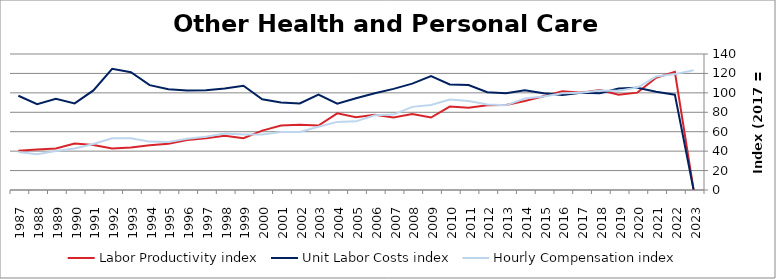
| Category | Labor Productivity index | Unit Labor Costs index | Hourly Compensation index |
|---|---|---|---|
| 2023.0 | 0 | 0 | 123.248 |
| 2022.0 | 121.561 | 98.136 | 119.295 |
| 2021.0 | 115.462 | 101.121 | 116.757 |
| 2020.0 | 100.213 | 105.193 | 105.417 |
| 2019.0 | 97.963 | 104.412 | 102.285 |
| 2018.0 | 102.927 | 99.529 | 102.443 |
| 2017.0 | 100 | 100 | 100 |
| 2016.0 | 101.666 | 97.87 | 99.501 |
| 2015.0 | 96.492 | 99.644 | 96.149 |
| 2014.0 | 91.615 | 102.758 | 94.141 |
| 2013.0 | 87.409 | 99.678 | 87.128 |
| 2012.0 | 87.284 | 100.739 | 87.929 |
| 2011.0 | 84.763 | 108.101 | 91.63 |
| 2010.0 | 85.842 | 108.611 | 93.234 |
| 2009.0 | 74.622 | 117.328 | 87.553 |
| 2008.0 | 78.127 | 109.525 | 85.569 |
| 2007.0 | 74.575 | 104.092 | 77.626 |
| 2006.0 | 77.366 | 99.515 | 76.991 |
| 2005.0 | 74.897 | 94.379 | 70.688 |
| 2004.0 | 78.91 | 88.837 | 70.101 |
| 2003.0 | 66.297 | 98.302 | 65.171 |
| 2002.0 | 67.13 | 89.056 | 59.784 |
| 2001.0 | 66.419 | 89.985 | 59.767 |
| 2000.0 | 61.13 | 93.329 | 57.052 |
| 1999.0 | 53.292 | 107.277 | 57.171 |
| 1998.0 | 55.728 | 104.375 | 58.166 |
| 1997.0 | 53.371 | 102.612 | 54.765 |
| 1996.0 | 51.502 | 102.445 | 52.761 |
| 1995.0 | 47.642 | 103.721 | 49.414 |
| 1994.0 | 46.151 | 107.919 | 49.806 |
| 1993.0 | 43.854 | 121.193 | 53.148 |
| 1992.0 | 42.638 | 124.809 | 53.216 |
| 1991.0 | 46.234 | 102.527 | 47.402 |
| 1990.0 | 47.907 | 89.199 | 42.733 |
| 1989.0 | 42.753 | 93.833 | 40.117 |
| 1988.0 | 41.666 | 88.282 | 36.784 |
| 1987.0 | 40.397 | 97.021 | 39.194 |